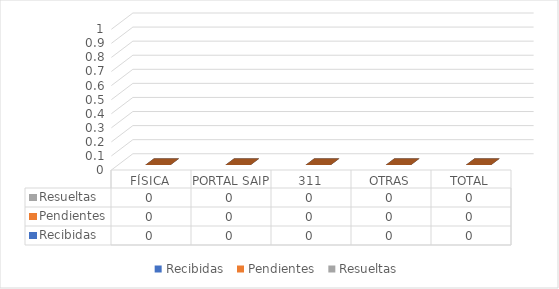
| Category | Recibidas  | Pendientes  | Resueltas |
|---|---|---|---|
| FÍSICA | 0 | 0 | 0 |
| PORTAL SAIP | 0 | 0 | 0 |
| 311 | 0 | 0 | 0 |
| OTRAS | 0 | 0 | 0 |
| TOTAL | 0 | 0 | 0 |